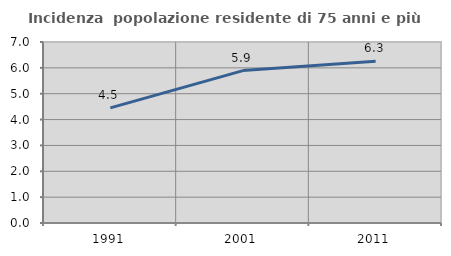
| Category | Incidenza  popolazione residente di 75 anni e più |
|---|---|
| 1991.0 | 4.454 |
| 2001.0 | 5.894 |
| 2011.0 | 6.258 |